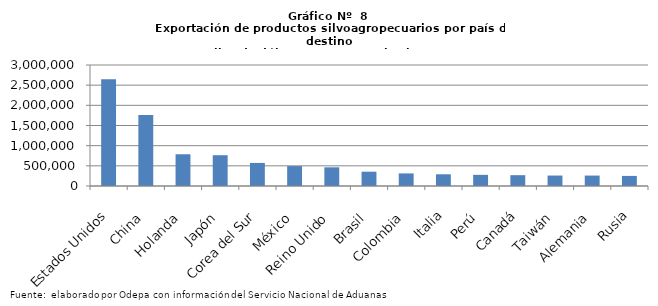
| Category | Series 0 |
|---|---|
| Estados Unidos | 2647534.047 |
| China | 1758329.307 |
| Holanda | 786630.242 |
| Japón | 763436.44 |
| Corea del Sur | 572071.618 |
| México | 493795.376 |
| Reino Unido | 463049.063 |
| Brasil | 354235.316 |
| Colombia | 311761.9 |
| Italia | 290601.529 |
| Perú | 276677.541 |
| Canadá | 268476.512 |
| Taiwán | 259290.808 |
| Alemania | 258727.826 |
| Rusia | 249882.826 |